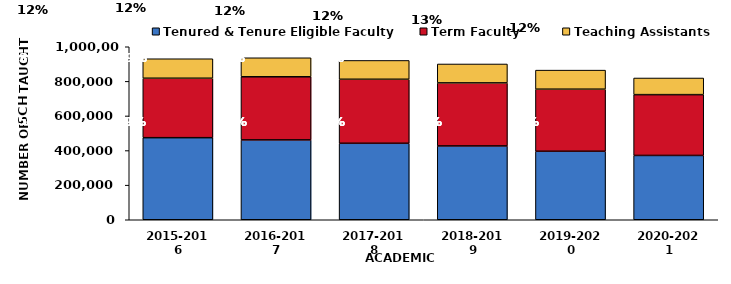
| Category | Tenured & Tenure Eligible Faculty | Term Faculty | Teaching Assistants |
|---|---|---|---|
| 2015-2016 | 474433.1 | 343592.3 | 112642.5 |
| 2016-2017 | 461534.6 | 364886.7 | 109893.8 |
| 2017-2018 | 442063.2 | 369996.7 | 108875.4 |
| 2018-2019 | 426701.9 | 364480.1 | 109197.7 |
| 2019-2020 | 395880.1 | 358821.8 | 110238.1 |
| 2020-2021 | 371729.3 | 351533.7 | 96149.7 |